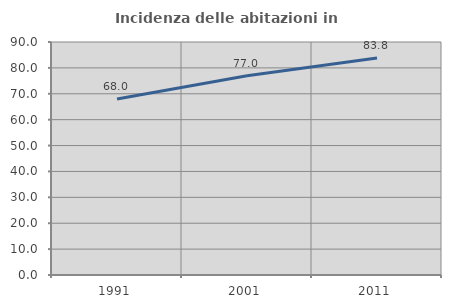
| Category | Incidenza delle abitazioni in proprietà  |
|---|---|
| 1991.0 | 68.016 |
| 2001.0 | 77 |
| 2011.0 | 83.838 |